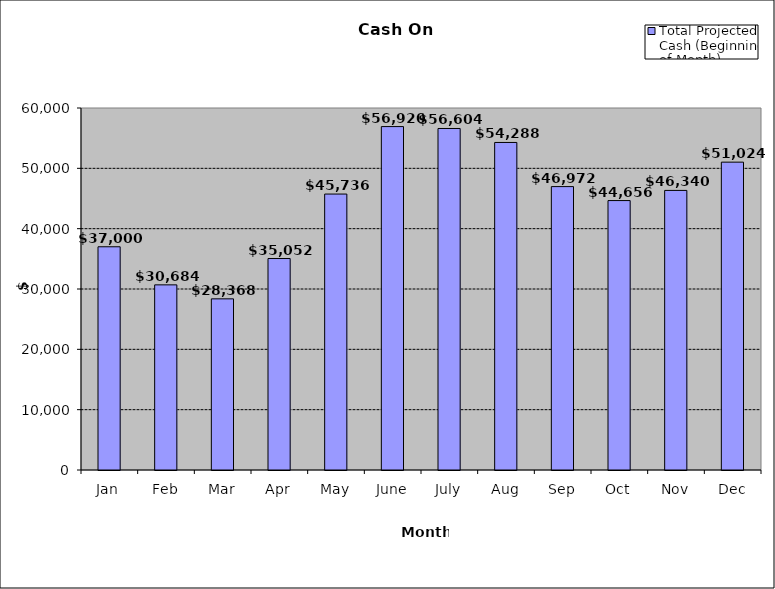
| Category | Total Projected Cash (Beginning of Month) |
|---|---|
| Jan | 37000 |
| Feb | 30684 |
| Mar | 28368 |
| Apr | 35052 |
| May | 45736 |
| June | 56920 |
| July | 56604 |
| Aug | 54288 |
| Sep | 46972 |
| Oct | 44656 |
| Nov | 46340 |
| Dec | 51024 |